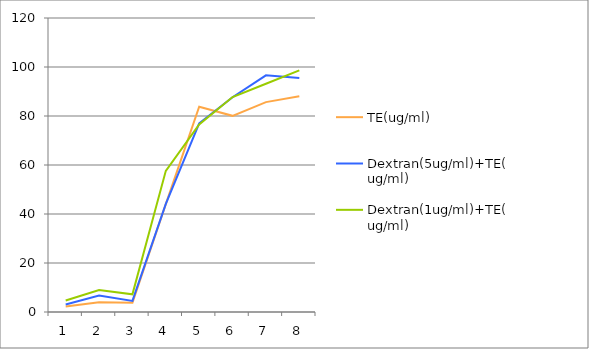
| Category | TE(ug/ml) | Dextran(5ug/ml)+TE(ug/ml) | Dextran(1ug/ml)+TE(ug/ml) |
|---|---|---|---|
| 0 | 2.23 | 3.035 | 4.717 |
| 1 | 3.949 | 6.691 | 8.958 |
| 2 | 3.803 | 4.534 | 7.203 |
| 3 | 44.022 | 44.095 | 57.623 |
| 4 | 83.803 | 77.038 | 76.527 |
| 5 | 80.073 | 87.642 | 87.751 |
| 6 | 85.667 | 96.6 | 93.163 |
| 7 | 88.044 | 95.466 | 98.611 |